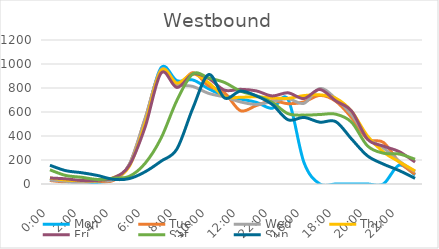
| Category | Mon | Tue | Wed | Thu | Fri | Sat | Sun |
|---|---|---|---|---|---|---|---|
| 0.0 | 42 | 29 | 33 | 50 | 50 | 118 | 156 |
| 0.041667 | 21 | 18 | 22 | 33 | 43 | 71 | 111 |
| 0.083333 | 14 | 32 | 9 | 27 | 29 | 56 | 94 |
| 0.125 | 13 | 24 | 29 | 27 | 30 | 38 | 71 |
| 0.166667 | 40 | 30 | 35 | 53 | 51 | 48 | 39 |
| 0.208333 | 157 | 162 | 164 | 147 | 156 | 64 | 45 |
| 0.25 | 528 | 546 | 547 | 507 | 476 | 173 | 102 |
| 0.291667 | 969 | 948 | 952 | 946 | 924 | 382 | 190 |
| 0.333333 | 861 | 815 | 834 | 841 | 804 | 697 | 292 |
| 0.375 | 867 | 928 | 813 | 918 | 916 | 917 | 631 |
| 0.416667 | 793 | 817 | 755 | 843 | 879 | 884 | 912 |
| 0.458333 | 735 | 760 | 725 | 728 | 782 | 846 | 717 |
| 0.5 | 708 | 611 | 684 | 723 | 789 | 774 | 774 |
| 0.541667 | 681 | 654 | 663 | 727 | 776 | 736 | 734 |
| 1900-01-02 22:00:00 | 631 | 694 | 687 | 718 | 734 | 680 | 663 |
| 0.625 | 705 | 669 | 711 | 714 | 760 | 586 | 535 |
| 0.666667 | 180 | 684 | 672 | 737 | 712 | 574 | 555 |
| 0.708333 | 0 | 738 | 796 | 743 | 788 | 579 | 515 |
| 0.75 | 0 | 690 | 712 | 715 | 693 | 582 | 520 |
| 0.791667 | 0 | 553 | 577 | 607 | 608 | 515 | 375 |
| 0.833333 | 0 | 375 | 387 | 401 | 374 | 318 | 235 |
| 0.875 | 0 | 347 | 301 | 267 | 316 | 257 | 166 |
| 0.916667 | 157 | 184 | 191 | 185 | 270 | 250 | 112 |
| 0.958333 | 75 | 81 | 103 | 109 | 183 | 206 | 47 |